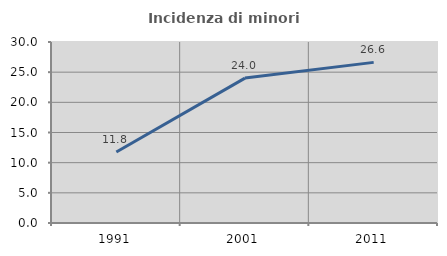
| Category | Incidenza di minori stranieri |
|---|---|
| 1991.0 | 11.765 |
| 2001.0 | 24.018 |
| 2011.0 | 26.622 |